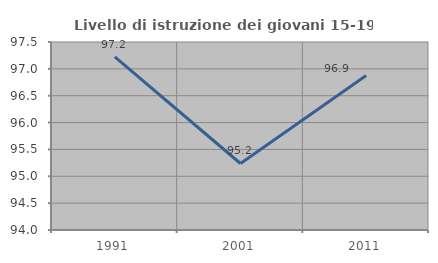
| Category | Livello di istruzione dei giovani 15-19 anni |
|---|---|
| 1991.0 | 97.222 |
| 2001.0 | 95.238 |
| 2011.0 | 96.875 |